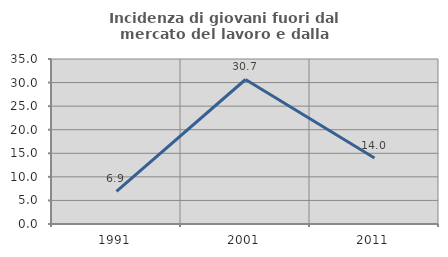
| Category | Incidenza di giovani fuori dal mercato del lavoro e dalla formazione  |
|---|---|
| 1991.0 | 6.931 |
| 2001.0 | 30.653 |
| 2011.0 | 14.01 |